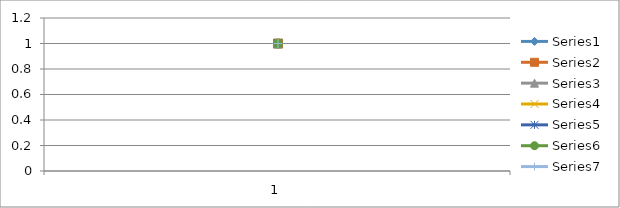
| Category | Series 0 | Series 1 | Series 2 | Series 3 | Series 4 | Series 5 | Series 6 |
|---|---|---|---|---|---|---|---|
| 0 | 1 | 1 | 1 | 1 | 1 | 1 | 1 |